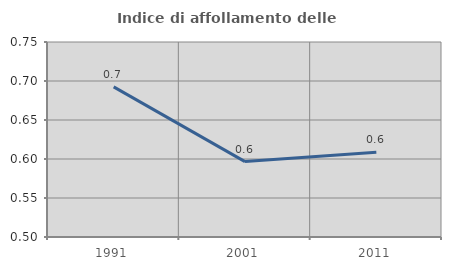
| Category | Indice di affollamento delle abitazioni  |
|---|---|
| 1991.0 | 0.693 |
| 2001.0 | 0.597 |
| 2011.0 | 0.609 |